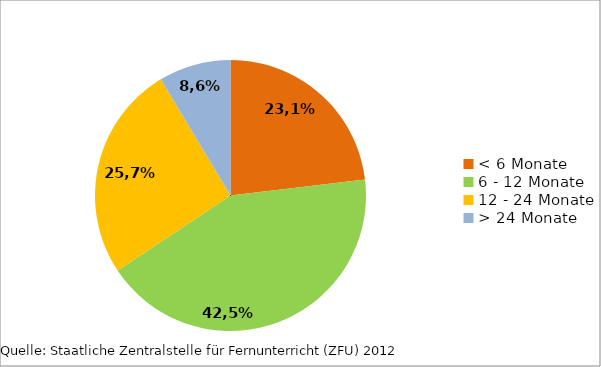
| Category | Series 0 |
|---|---|
| < 6 Monate | 0.231 |
| 6 - 12 Monate | 0.425 |
| 12 - 24 Monate | 0.257 |
| > 24 Monate | 0.086 |